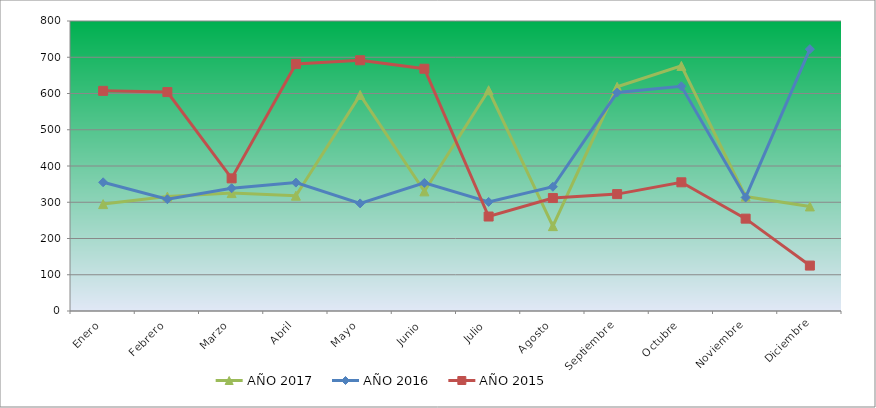
| Category | AÑO 2017 | AÑO 2016 | AÑO 2015 |
|---|---|---|---|
| Enero | 294.87 | 355.031 | 607.301 |
| Febrero | 315.646 | 308.295 | 603.96 |
| Marzo | 325.236 | 338.632 | 365.884 |
| Abril | 318.044 | 354.211 | 681.648 |
| Mayo | 596.132 | 296.815 | 691.672 |
| Junio | 330.03 | 353.391 | 668.282 |
| Julio | 608.918 | 300.915 | 260.63 |
| Agosto | 234.138 | 342.732 | 311.586 |
| Septiembre | 618.507 | 602.65 | 322.446 |
| Octubre | 676.043 | 619.869 | 355.025 |
| Noviembre | 315.646 | 313.214 | 254.782 |
| Diciembre | 288.477 | 722.36 | 125.303 |